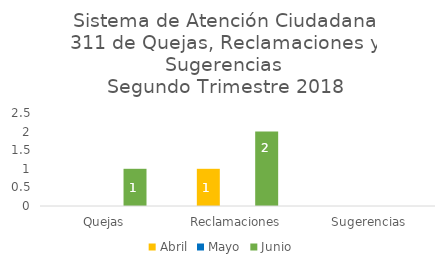
| Category | Abril | Mayo | Junio |
|---|---|---|---|
| Quejas | 0 | 0 | 1 |
| Reclamaciones | 1 | 0 | 2 |
| Sugerencias | 0 | 0 | 0 |